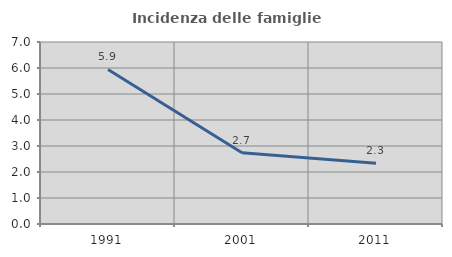
| Category | Incidenza delle famiglie numerose |
|---|---|
| 1991.0 | 5.943 |
| 2001.0 | 2.738 |
| 2011.0 | 2.338 |